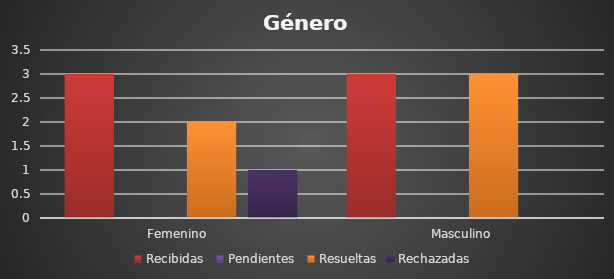
| Category | Recibidas  | Pendientes  | Resueltas | Rechazadas  |
|---|---|---|---|---|
| Femenino  | 3 | 0 | 2 | 1 |
| Masculino | 3 | 0 | 3 | 0 |